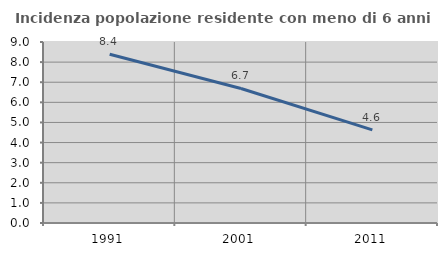
| Category | Incidenza popolazione residente con meno di 6 anni |
|---|---|
| 1991.0 | 8.389 |
| 2001.0 | 6.689 |
| 2011.0 | 4.631 |